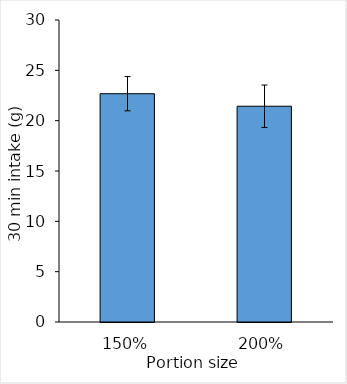
| Category | Series 0 |
|---|---|
| 1.5 | 22.678 |
| 2.0 | 21.433 |